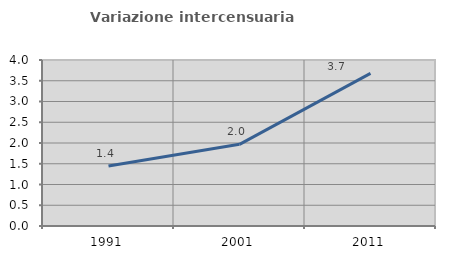
| Category | Variazione intercensuaria annua |
|---|---|
| 1991.0 | 1.447 |
| 2001.0 | 1.969 |
| 2011.0 | 3.679 |